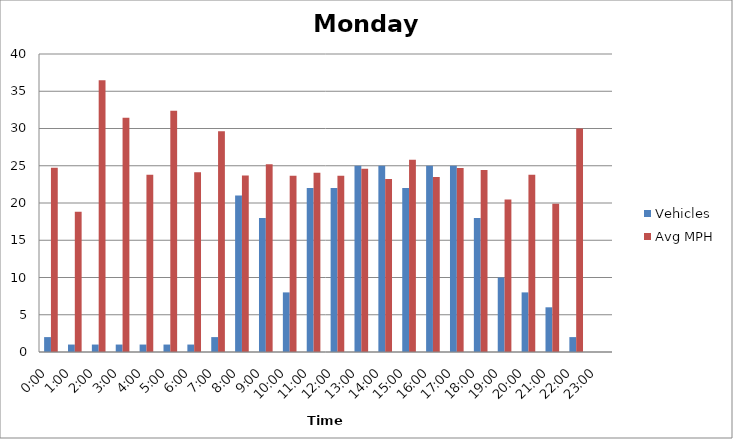
| Category | Vehicles | Avg MPH |
|---|---|---|
| 0:00 | 2 | 24.73 |
| 1:00 | 1 | 18.83 |
| 2:00 | 1 | 36.47 |
| 3:00 | 1 | 31.45 |
| 4:00 | 1 | 23.8 |
| 5:00 | 1 | 32.37 |
| 6:00 | 1 | 24.12 |
| 7:00 | 2 | 29.62 |
| 8:00 | 21 | 23.68 |
| 9:00 | 18 | 25.21 |
| 10:00 | 8 | 23.65 |
| 11:00 | 22 | 24.05 |
| 12:00 | 22 | 23.66 |
| 13:00 | 25 | 24.6 |
| 14:00 | 25 | 23.23 |
| 15:00 | 22 | 25.8 |
| 16:00 | 25 | 23.48 |
| 17:00 | 25 | 24.69 |
| 18:00 | 18 | 24.43 |
| 19:00 | 10 | 20.48 |
| 20:00 | 8 | 23.79 |
| 21:00 | 6 | 19.91 |
| 22:00 | 2 | 30.01 |
| 23:00 | 0 | 0 |